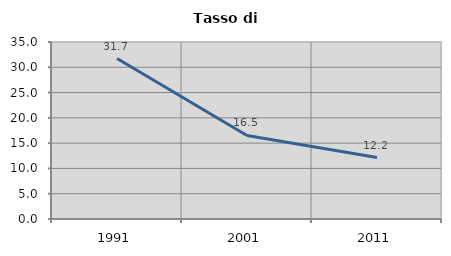
| Category | Tasso di disoccupazione   |
|---|---|
| 1991.0 | 31.735 |
| 2001.0 | 16.517 |
| 2011.0 | 12.154 |